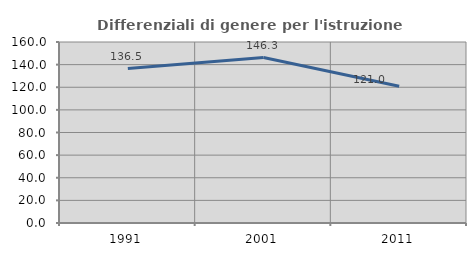
| Category | Differenziali di genere per l'istruzione superiore |
|---|---|
| 1991.0 | 136.494 |
| 2001.0 | 146.279 |
| 2011.0 | 120.953 |